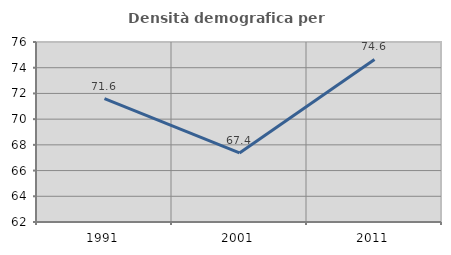
| Category | Densità demografica |
|---|---|
| 1991.0 | 71.6 |
| 2001.0 | 67.373 |
| 2011.0 | 74.641 |